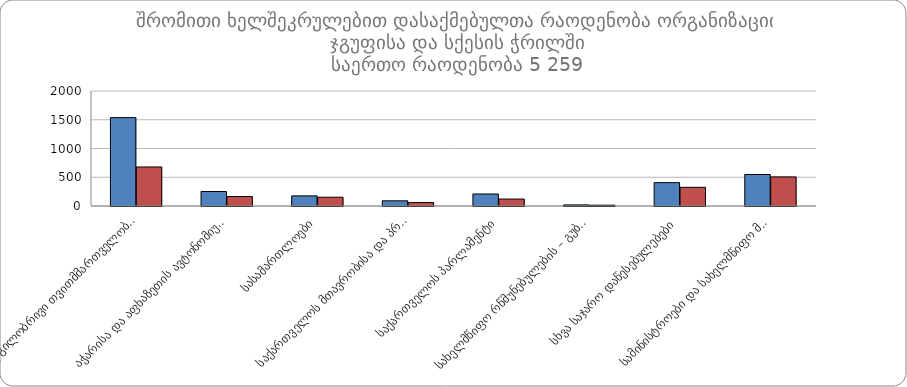
| Category |  მამრობითი |  მდედრობითი |
|---|---|---|
|  ადგილობრივი თვითმმართველობის ორგანოები | 1537 | 679 |
|  აჭარისა და აფხაზეთის ავტონომიური რესპუბლიკები | 252 | 164 |
|  სასამართლოები | 176 | 153 |
|  საქართველოს მთავრობისა და პრეზიდენტის ადმინისტრაციებიანისტრაციები | 90 | 60 |
|  საქართველოს პარლამენტი | 209 | 121 |
|  სახელმწიფო რწმუნებულების – გუბერნატორების ადმინისტრაციები ადმინისტრაციები | 19 | 14 |
|  სხვა საჯარო დაწესებულებები | 406 | 325 |
|  სამინისტროები და სახელმწიფო მინისტრების აპარატი | 548 | 506 |